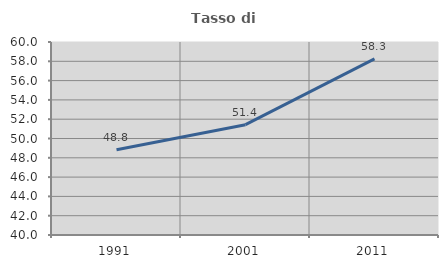
| Category | Tasso di occupazione   |
|---|---|
| 1991.0 | 48.828 |
| 2001.0 | 51.434 |
| 2011.0 | 58.255 |